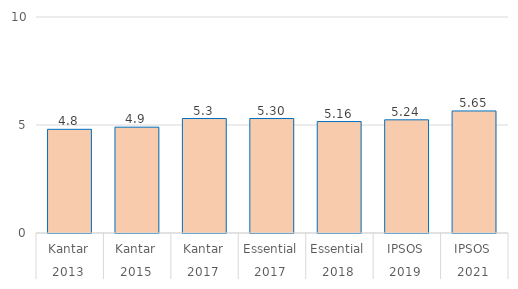
| Category | Corrected mean |
|---|---|
| 0 | 4.8 |
| 1 | 4.9 |
| 2 | 5.3 |
| 3 | 5.3 |
| 4 | 5.16 |
| 5 | 5.24 |
| 6 | 5.65 |